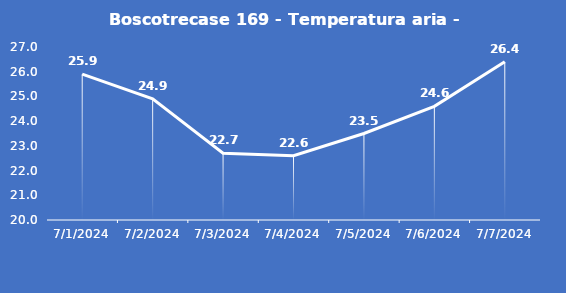
| Category | Boscotrecase 169 - Temperatura aria - Grezzo (°C) |
|---|---|
| 7/1/24 | 25.9 |
| 7/2/24 | 24.9 |
| 7/3/24 | 22.7 |
| 7/4/24 | 22.6 |
| 7/5/24 | 23.5 |
| 7/6/24 | 24.6 |
| 7/7/24 | 26.4 |